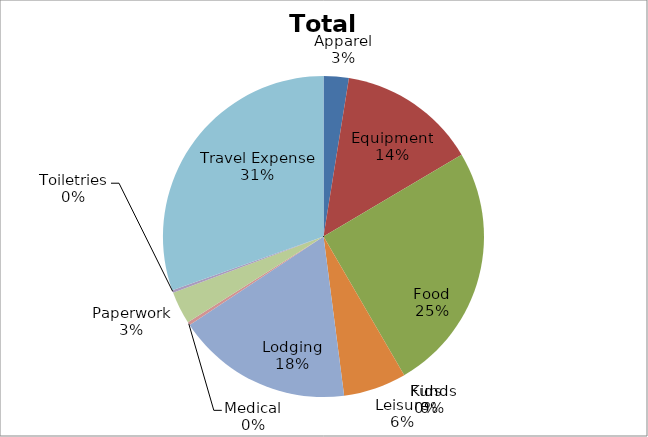
| Category | Total |
|---|---|
| Apparel | 214 |
| Equipment | 1177 |
| Food | 2120 |
| Funds | 0 |
| Kids | 0 |
| Leisure | 535 |
| Lodging | 1498 |
| Medical | 26.75 |
| Paperwork | 278.2 |
| Toiletries | 21.4 |
| Travel Expense | 2568 |